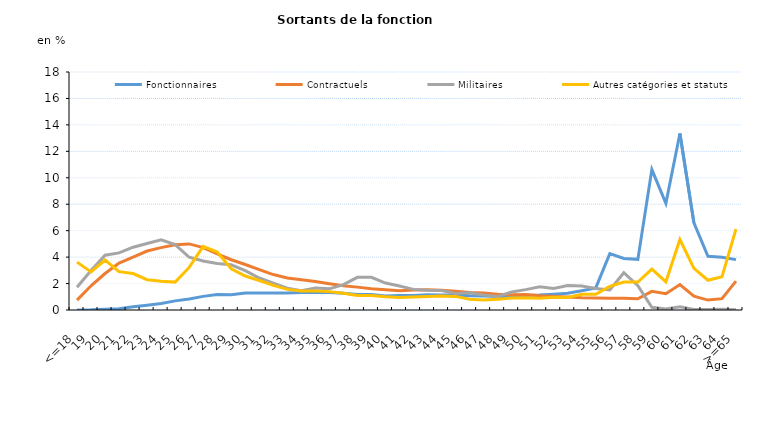
| Category | Fonctionnaires | Contractuels | Militaires | Autres catégories et statuts |
|---|---|---|---|---|
| <=18 | 0 | 0.75 | 1.72 | 3.62 |
| 19 | 0.01 | 1.83 | 2.98 | 2.88 |
| 20 | 0.05 | 2.76 | 4.14 | 3.78 |
| 21 | 0.09 | 3.55 | 4.32 | 2.9 |
| 22 | 0.24 | 4 | 4.75 | 2.76 |
| 23 | 0.36 | 4.46 | 5.03 | 2.29 |
| 24 | 0.49 | 4.72 | 5.31 | 2.18 |
| 25 | 0.69 | 4.94 | 4.94 | 2.11 |
| 26 | 0.83 | 5 | 3.99 | 3.22 |
| 27 | 1.03 | 4.72 | 3.71 | 4.81 |
| 28 | 1.17 | 4.24 | 3.52 | 4.38 |
| 29 | 1.16 | 3.8 | 3.42 | 3.12 |
| 30 | 1.28 | 3.44 | 2.97 | 2.57 |
| 31 | 1.28 | 3.05 | 2.42 | 2.23 |
| 32 | 1.28 | 2.68 | 2.03 | 1.86 |
| 33 | 1.28 | 2.42 | 1.65 | 1.56 |
| 34 | 1.32 | 2.29 | 1.46 | 1.43 |
| 35 | 1.34 | 2.16 | 1.67 | 1.44 |
| 36 | 1.33 | 1.99 | 1.6 | 1.39 |
| 37 | 1.26 | 1.83 | 1.92 | 1.26 |
| 38 | 1.18 | 1.73 | 2.47 | 1.09 |
| 39 | 1.17 | 1.61 | 2.47 | 1.1 |
| 40 | 1.06 | 1.53 | 2.04 | 1.01 |
| 41 | 1.09 | 1.45 | 1.82 | 0.95 |
| 42 | 1.09 | 1.52 | 1.56 | 0.99 |
| 43 | 1.16 | 1.53 | 1.49 | 1.02 |
| 44 | 1.14 | 1.5 | 1.47 | 1.05 |
| 45 | 1.13 | 1.42 | 1.25 | 1.03 |
| 46 | 1.07 | 1.33 | 1.3 | 0.81 |
| 47 | 1.05 | 1.29 | 1.13 | 0.76 |
| 48 | 1.03 | 1.19 | 1.02 | 0.82 |
| 49 | 1.01 | 1.15 | 1.36 | 0.9 |
| 50 | 1.1 | 1.17 | 1.54 | 0.93 |
| 51 | 1.13 | 1.07 | 1.75 | 0.88 |
| 52 | 1.19 | 1.03 | 1.63 | 0.97 |
| 53 | 1.26 | 0.99 | 1.85 | 0.94 |
| 54 | 1.46 | 0.93 | 1.81 | 1.19 |
| 55 | 1.67 | 0.9 | 1.63 | 1.19 |
| 56 | 4.26 | 0.89 | 1.52 | 1.79 |
| 57 | 3.9 | 0.88 | 2.82 | 2.11 |
| 58 | 3.83 | 0.85 | 1.84 | 2.11 |
| 59 | 10.62 | 1.41 | 0.2 | 3.09 |
| 60 | 8.07 | 1.23 | 0.08 | 2.13 |
| 61 | 13.35 | 1.92 | 0.25 | 5.33 |
| 62 | 6.59 | 1.04 | 0.04 | 3.15 |
| 63 | 4.06 | 0.75 | 0.04 | 2.25 |
| 64 | 3.99 | 0.86 | 0.06 | 2.51 |
| >=65 | 3.81 | 2.18 | 0.02 | 6.12 |